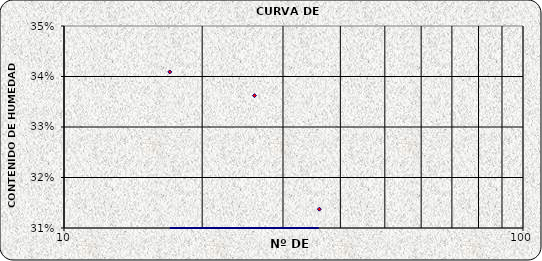
| Category | Series 0 |
|---|---|
| 36.0 | 0.314 |
| 26.0 | 0.336 |
| 17.0 | 0.341 |